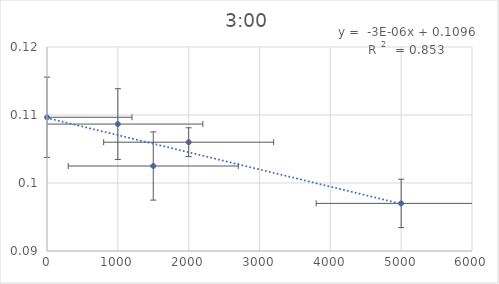
| Category | Series 0 |
|---|---|
| 5000.0 | 0.097 |
| 2000.0 | 0.106 |
| 1500.0 | 0.102 |
| 1000.0 | 0.109 |
| 0.0 | 0.11 |